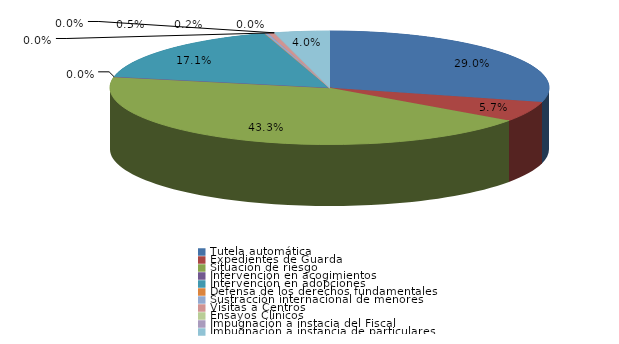
| Category | Series 0 |
|---|---|
| Tutela automática | 122 |
| Expedientes de Guarda | 24 |
| Situación de riesgo | 182 |
| Intervención en acogimientos | 0 |
| Intervención en adopciones | 72 |
| Defensa de los derechos fundamentales | 0 |
| Sustracción internacional de menores | 1 |
| Visitas a Centros | 2 |
| Ensayos Clínicos | 0 |
| Impugnación a instacia del Fiscal | 0 |
| Impugnación a instancia de particulares | 17 |